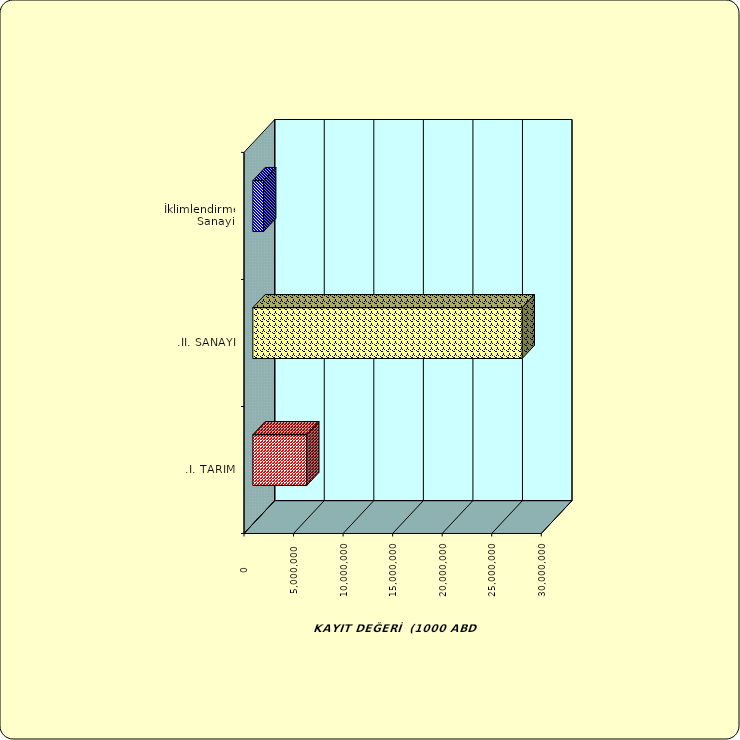
| Category | Series 0 |
|---|---|
| .I. TARIM | 5434010.89 |
| .II. SANAYİ | 27184046.371 |
|  İklimlendirme Sanayii | 1087927.309 |